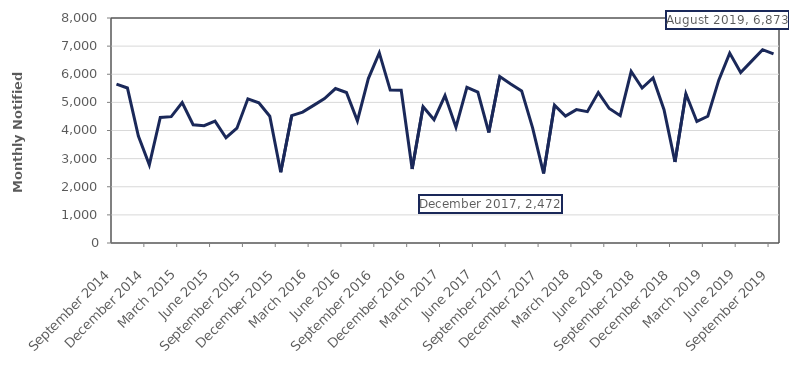
| Category | Series 0 |
|---|---|
| 2014-09-01 | 5651 |
| 2014-10-01 | 5512 |
| 2014-11-01 | 3803 |
| 2014-12-01 | 2780 |
| 2015-01-01 | 4466 |
| 2015-02-01 | 4492 |
| 2015-03-01 | 4995 |
| 2015-04-01 | 4204 |
| 2015-05-01 | 4172 |
| 2015-06-01 | 4331 |
| 2015-07-01 | 3743 |
| 2015-08-01 | 4083 |
| 2015-09-01 | 5127 |
| 2015-10-01 | 4983 |
| 2015-11-01 | 4507 |
| 2015-12-01 | 2513 |
| 2016-01-01 | 4527 |
| 2016-02-01 | 4654 |
| 2016-03-01 | 4894 |
| 2016-04-01 | 5134 |
| 2016-05-01 | 5491 |
| 2016-06-01 | 5350 |
| 2016-07-01 | 4342 |
| 2016-08-01 | 5846 |
| 2016-09-01 | 6758 |
| 2016-10-01 | 5438 |
| 2016-11-01 | 5433 |
| 2016-12-01 | 2634 |
| 2017-01-01 | 4847 |
| 2017-02-01 | 4383 |
| 2017-03-01 | 5241 |
| 2017-04-01 | 4120 |
| 2017-05-01 | 5532 |
| 2017-06-01 | 5362 |
| 2017-07-01 | 3929 |
| 2017-08-01 | 5919 |
| 2017-09-01 | 5656 |
| 2017-10-01 | 5408 |
| 2017-11-01 | 4092 |
| 2017-12-01 | 2472 |
| 2018-01-01 | 4900 |
| 2018-02-01 | 4515 |
| 2018-03-01 | 4742 |
| 2018-04-01 | 4671 |
| 2018-05-01 | 5349 |
| 2018-06-01 | 4782 |
| 2018-07-01 | 4528 |
| 2018-08-01 | 6097 |
| 2018-09-01 | 5510 |
| 2018-10-01 | 5868 |
| 2018-11-01 | 4740 |
| 2018-12-01 | 2884 |
| 2019-01-01 | 5305 |
| 2019-02-01 | 4322 |
| 2019-03-01 | 4507 |
| 2019-04-01 | 5791 |
| 2019-05-01 | 6751 |
| 2019-06-01 | 6065 |
| 2019-07-01 | 6467 |
| 2019-08-01 | 6873 |
| 2019-09-01 | 6721 |